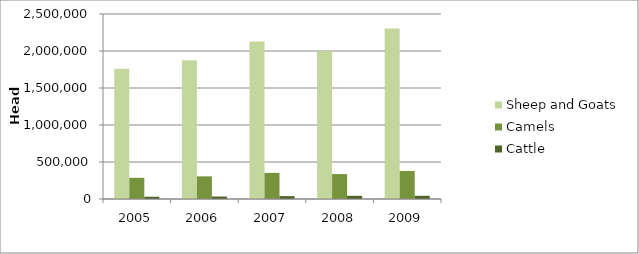
| Category | Sheep and Goats | Camels | Cattle |
|---|---|---|---|
| 2005.0 | 1761713 | 286265 | 30630 |
| 2006.0 | 1876054 | 306068 | 33430 |
| 2007.0 | 2127604 | 353337 | 38900 |
| 2008.0 | 1998280 | 336901 | 42596 |
| 2009.0 | 2305603 | 378076 | 42992 |